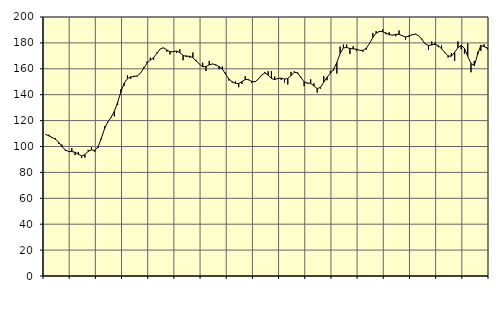
| Category | Piggar | Series 1 |
|---|---|---|
| nan | 109.1 | 109.36 |
| 87.0 | 109.1 | 108.2 |
| 87.0 | 106.6 | 106.95 |
| 87.0 | 106.4 | 105.59 |
| nan | 101.9 | 103.23 |
| 88.0 | 101.5 | 100 |
| 88.0 | 96.8 | 97.39 |
| 88.0 | 96 | 96.13 |
| nan | 98.8 | 96.05 |
| 89.0 | 93.4 | 95.6 |
| 89.0 | 95.8 | 94 |
| 89.0 | 91.1 | 92.74 |
| nan | 91.4 | 93.73 |
| 90.0 | 97.4 | 96.26 |
| 90.0 | 99.6 | 97.35 |
| 90.0 | 95.8 | 97.05 |
| nan | 98.7 | 99.54 |
| 91.0 | 105.5 | 106.22 |
| 91.0 | 115.7 | 113.7 |
| 91.0 | 118.4 | 119.02 |
| nan | 122.8 | 122.49 |
| 92.0 | 123.2 | 127.15 |
| 92.0 | 132 | 134.08 |
| 92.0 | 144.3 | 142.15 |
| nan | 147 | 148.83 |
| 93.0 | 154.9 | 152.35 |
| 93.0 | 152.2 | 153.77 |
| 93.0 | 154.6 | 154.04 |
| nan | 154.1 | 154.56 |
| 94.0 | 156.5 | 156.63 |
| 94.0 | 161.2 | 160.48 |
| 94.0 | 165.6 | 164.4 |
| nan | 168.6 | 166.68 |
| 95.0 | 166.9 | 168.72 |
| 95.0 | 172.6 | 171.88 |
| 95.0 | 175.2 | 175.32 |
| nan | 175.9 | 176.26 |
| 96.0 | 173.1 | 174.65 |
| 96.0 | 171.1 | 173.14 |
| 96.0 | 173.6 | 173.24 |
| nan | 172.2 | 173.7 |
| 97.0 | 175.1 | 172.51 |
| 97.0 | 166.6 | 170.37 |
| 97.0 | 170.3 | 169.58 |
| nan | 168.6 | 169.73 |
| 98.0 | 172.6 | 168.59 |
| 98.0 | 166.9 | 166.14 |
| 98.0 | 163.7 | 163.56 |
| nan | 164.7 | 161.59 |
| 99.0 | 158.3 | 161.73 |
| 99.0 | 166.1 | 163.03 |
| 99.0 | 163.6 | 163.77 |
| nan | 162.6 | 163.07 |
| 0.0 | 159.7 | 161.71 |
| 0.0 | 161.7 | 159.82 |
| 0.0 | 157 | 155.83 |
| nan | 150.8 | 152.11 |
| 1.0 | 149.3 | 150.02 |
| 1.0 | 150.3 | 148.8 |
| 1.0 | 145.8 | 148.66 |
| nan | 148.2 | 150.12 |
| 2.0 | 154.3 | 151.82 |
| 2.0 | 151.2 | 151.65 |
| 2.0 | 149 | 150.24 |
| nan | 150.1 | 150.01 |
| 3.0 | 152.2 | 151.98 |
| 3.0 | 155 | 155.21 |
| 3.0 | 157.4 | 156.74 |
| nan | 158.1 | 155.14 |
| 4.0 | 158.3 | 152.58 |
| 4.0 | 154.1 | 151.64 |
| 4.0 | 152.8 | 152.55 |
| nan | 151.4 | 152.81 |
| 5.0 | 149.4 | 152.07 |
| 5.0 | 147.9 | 152.5 |
| 5.0 | 157.6 | 154.77 |
| nan | 158.1 | 157.28 |
| 6.0 | 156.2 | 156.93 |
| 6.0 | 153.9 | 153.37 |
| 6.0 | 146.6 | 149.91 |
| nan | 148.5 | 149.02 |
| 7.0 | 151.9 | 148.78 |
| 7.0 | 148.7 | 146.77 |
| 7.0 | 141.6 | 144.7 |
| nan | 144.7 | 145.69 |
| 8.0 | 154.4 | 149.66 |
| 8.0 | 151.2 | 153.49 |
| 8.0 | 158.5 | 156.39 |
| nan | 158.6 | 159.51 |
| 9.0 | 156.3 | 164.88 |
| 9.0 | 177.2 | 171.81 |
| 9.0 | 178.7 | 176.12 |
| nan | 178.7 | 176.51 |
| 10.0 | 171.4 | 175.66 |
| 10.0 | 177.5 | 175.38 |
| 10.0 | 173.6 | 175.16 |
| nan | 174.2 | 174.24 |
| 11.0 | 173.2 | 174.18 |
| 11.0 | 174.7 | 175.94 |
| 11.0 | 179.5 | 179.66 |
| nan | 187.7 | 184.21 |
| 12.0 | 189.1 | 187.51 |
| 12.0 | 188.4 | 188.88 |
| 12.0 | 190.4 | 188.64 |
| nan | 186.6 | 187.69 |
| 13.0 | 188.2 | 186.37 |
| 13.0 | 185.6 | 185.97 |
| 13.0 | 185.1 | 186.58 |
| nan | 189.6 | 186.59 |
| 14.0 | 185.8 | 185.56 |
| 14.0 | 182.5 | 184.61 |
| 14.0 | 185.7 | 185.03 |
| nan | 186.1 | 186.29 |
| 15.0 | 187 | 186.73 |
| 15.0 | 185.4 | 185.58 |
| 15.0 | 183.2 | 182.66 |
| nan | 179.4 | 179.22 |
| 16.0 | 174.6 | 177.99 |
| 16.0 | 181.1 | 178.45 |
| 16.0 | 180.4 | 178.91 |
| nan | 176.7 | 177.9 |
| 17.0 | 178.1 | 175.47 |
| 17.0 | 172.2 | 172.62 |
| 17.0 | 168.7 | 169.93 |
| nan | 172.2 | 169.72 |
| 18.0 | 166 | 172.74 |
| 18.0 | 181.1 | 176.23 |
| 18.0 | 175 | 178.13 |
| nan | 171.6 | 175.85 |
| 19.0 | 179.6 | 169.64 |
| 19.0 | 157.3 | 164.13 |
| 19.0 | 166 | 162.5 |
| nan | 173.1 | 170.88 |
| 20.0 | 173.9 | 178.12 |
| 20.0 | 178.9 | 177.13 |
| 20.0 | 175 | 176.13 |